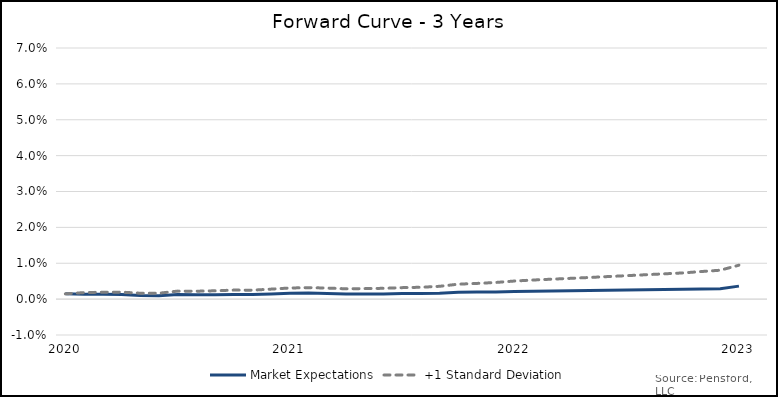
| Category | Market Expectations | +1 Standard Deviation |
|---|---|---|
| 2020-12-31 | 0.001 | 0.001 |
| 2021-01-31 | 0.001 | 0.002 |
| 2021-02-28 | 0.001 | 0.002 |
| 2021-03-28 | 0.001 | 0.002 |
| 2021-04-28 | 0.001 | 0.002 |
| 2021-05-28 | 0.001 | 0.002 |
| 2021-06-28 | 0.001 | 0.002 |
| 2021-07-28 | 0.001 | 0.002 |
| 2021-08-28 | 0.001 | 0.002 |
| 2021-09-28 | 0.001 | 0.003 |
| 2021-10-28 | 0.001 | 0.002 |
| 2021-11-28 | 0.001 | 0.003 |
| 2021-12-28 | 0.002 | 0.003 |
| 2022-01-28 | 0.002 | 0.003 |
| 2022-02-28 | 0.002 | 0.003 |
| 2022-03-28 | 0.001 | 0.003 |
| 2022-04-28 | 0.001 | 0.003 |
| 2022-05-28 | 0.001 | 0.003 |
| 2022-06-28 | 0.002 | 0.003 |
| 2022-07-28 | 0.002 | 0.003 |
| 2022-08-28 | 0.002 | 0.004 |
| 2022-09-28 | 0.002 | 0.004 |
| 2022-10-28 | 0.002 | 0.004 |
| 2022-11-28 | 0.002 | 0.005 |
| 2022-12-28 | 0.002 | 0.005 |
| 2023-01-28 | 0.002 | 0.005 |
| 2023-02-28 | 0.002 | 0.006 |
| 2023-03-28 | 0.002 | 0.006 |
| 2023-04-28 | 0.002 | 0.006 |
| 2023-05-28 | 0.002 | 0.006 |
| 2023-06-28 | 0.003 | 0.007 |
| 2023-07-28 | 0.003 | 0.007 |
| 2023-08-28 | 0.003 | 0.007 |
| 2023-09-28 | 0.003 | 0.007 |
| 2023-10-28 | 0.003 | 0.008 |
| 2023-11-28 | 0.003 | 0.008 |
| 2023-12-28 | 0.004 | 0.009 |
| 2024-01-28 | 0.004 | 0.01 |
| 2024-02-28 | 0.004 | 0.011 |
| 2024-03-28 | 0.004 | 0.011 |
| 2024-04-28 | 0.004 | 0.012 |
| 2024-05-28 | 0.004 | 0.012 |
| 2024-06-28 | 0.005 | 0.012 |
| 2024-07-28 | 0.005 | 0.013 |
| 2024-08-28 | 0.005 | 0.013 |
| 2024-09-28 | 0.005 | 0.014 |
| 2024-10-28 | 0.005 | 0.014 |
| 2024-11-28 | 0.005 | 0.014 |
| 2024-12-28 | 0.006 | 0.016 |
| 2025-01-28 | 0.007 | 0.016 |
| 2025-02-28 | 0.007 | 0.017 |
| 2025-03-28 | 0.007 | 0.017 |
| 2025-04-28 | 0.007 | 0.018 |
| 2025-05-28 | 0.007 | 0.018 |
| 2025-06-28 | 0.007 | 0.019 |
| 2025-07-28 | 0.008 | 0.02 |
| 2025-08-28 | 0.008 | 0.02 |
| 2025-09-28 | 0.008 | 0.021 |
| 2025-10-28 | 0.008 | 0.021 |
| 2025-11-28 | 0.008 | 0.022 |
| 2025-12-28 | 0.009 | 0.023 |
| 2026-01-28 | 0.009 | 0.024 |
| 2026-02-28 | 0.009 | 0.024 |
| 2026-03-28 | 0.01 | 0.025 |
| 2026-04-28 | 0.01 | 0.025 |
| 2026-05-28 | 0.01 | 0.026 |
| 2026-06-28 | 0.01 | 0.027 |
| 2026-07-28 | 0.01 | 0.027 |
| 2026-08-28 | 0.01 | 0.028 |
| 2026-09-28 | 0.011 | 0.028 |
| 2026-10-28 | 0.011 | 0.027 |
| 2026-11-28 | 0.011 | 0.026 |
| 2026-12-28 | 0.011 | 0.025 |
| 2027-01-28 | 0.011 | 0.025 |
| 2027-02-28 | 0.012 | 0.026 |
| 2027-03-28 | 0.012 | 0.026 |
| 2027-04-28 | 0.012 | 0.027 |
| 2027-05-28 | 0.012 | 0.027 |
| 2027-06-28 | 0.012 | 0.028 |
| 2027-07-28 | 0.012 | 0.028 |
| 2027-08-28 | 0.013 | 0.029 |
| 2027-09-28 | 0.013 | 0.029 |
| 2027-10-28 | 0.013 | 0.033 |
| 2027-11-28 | 0.013 | 0.038 |
| 2027-12-28 | 0.013 | 0.042 |
| 2028-01-28 | 0.013 | 0.043 |
| 2028-02-28 | 0.013 | 0.044 |
| 2028-03-28 | 0.013 | 0.044 |
| 2028-04-28 | 0.013 | 0.045 |
| 2028-05-28 | 0.013 | 0.046 |
| 2028-06-28 | 0.014 | 0.046 |
| 2028-07-28 | 0.014 | 0.047 |
| 2028-08-28 | 0.014 | 0.048 |
| 2028-09-28 | 0.014 | 0.048 |
| 2028-10-28 | 0.014 | 0.047 |
| 2028-11-28 | 0.014 | 0.044 |
| 2028-12-28 | 0.014 | 0.041 |
| 2029-01-28 | 0.014 | 0.041 |
| 2029-02-28 | 0.014 | 0.042 |
| 2029-03-28 | 0.014 | 0.042 |
| 2029-04-28 | 0.014 | 0.043 |
| 2029-05-28 | 0.015 | 0.043 |
| 2029-06-28 | 0.015 | 0.044 |
| 2029-07-28 | 0.015 | 0.044 |
| 2029-08-28 | 0.015 | 0.045 |
| 2029-09-28 | 0.015 | 0.045 |
| 2029-10-28 | 0.015 | 0.042 |
| 2029-11-28 | 0.015 | 0.039 |
| 2029-12-28 | 0.015 | 0.035 |
| 2030-01-28 | 0.015 | 0.035 |
| 2030-02-28 | 0.015 | 0.035 |
| 2030-03-28 | 0.015 | 0.036 |
| 2030-04-28 | 0.015 | 0.036 |
| 2030-05-28 | 0.016 | 0.036 |
| 2030-06-28 | 0.016 | 0.037 |
| 2030-07-28 | 0.016 | 0.037 |
| 2030-08-28 | 0.016 | 0.038 |
| 2030-09-28 | 0.016 | 0.038 |
| 2030-10-28 | 0.016 | 0.037 |
| 2030-11-28 | 0.016 | 0.035 |